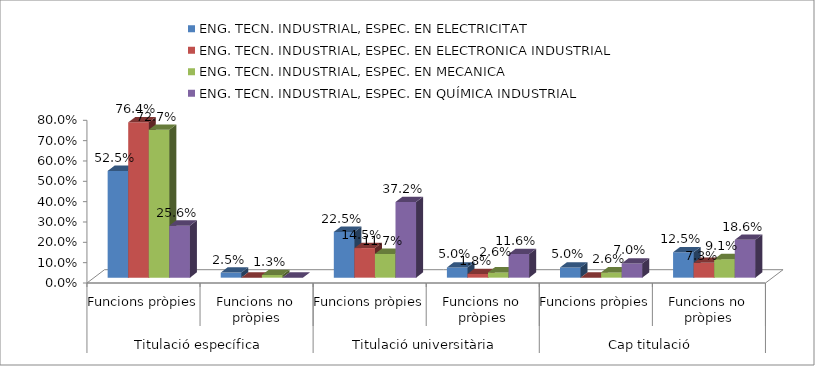
| Category | ENG. TECN. INDUSTRIAL, ESPEC. EN ELECTRICITAT | ENG. TECN. INDUSTRIAL, ESPEC. EN ELECTRONICA INDUSTRIAL | ENG. TECN. INDUSTRIAL, ESPEC. EN MECANICA | ENG. TECN. INDUSTRIAL, ESPEC. EN QUÍMICA INDUSTRIAL |
|---|---|---|---|---|
| 0 | 0.525 | 0.764 | 0.727 | 0.256 |
| 1 | 0.025 | 0 | 0.013 | 0 |
| 2 | 0.225 | 0.145 | 0.117 | 0.372 |
| 3 | 0.05 | 0.018 | 0.026 | 0.116 |
| 4 | 0.05 | 0 | 0.026 | 0.07 |
| 5 | 0.125 | 0.073 | 0.091 | 0.186 |